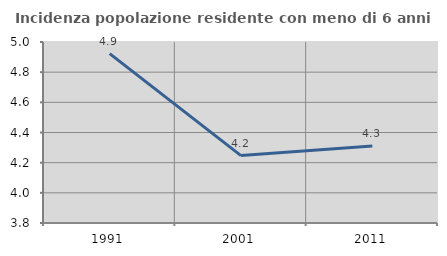
| Category | Incidenza popolazione residente con meno di 6 anni |
|---|---|
| 1991.0 | 4.923 |
| 2001.0 | 4.247 |
| 2011.0 | 4.311 |